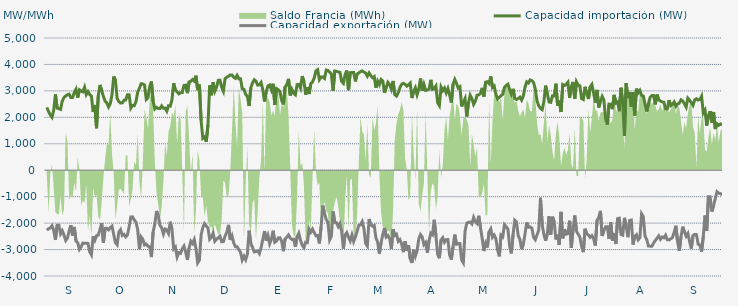
| Category | Capacidad importación (MW) | Capacidad exportación (MW) |
|---|---|---|
| 0 | 2375 | -2269.958 |
| 1900-01-01 | 2218.75 | -2210.458 |
| 1900-01-02 | 2093.75 | -2184.542 |
| 1900-01-03 | 2002.083 | -2097.042 |
| 1900-01-04 | 2264.583 | -2273.583 |
| 1900-01-05 | 2866.875 | -2637 |
| 1900-01-06 | 2346.958 | -2079.75 |
| 1900-01-07 | 2329.625 | -2082.083 |
| 1900-01-08 | 2302.458 | -2405.417 |
| 1900-01-09 | 2617.333 | -2289.667 |
| 1900-01-10 | 2750.042 | -2452.833 |
| 1900-01-11 | 2809.125 | -2657.958 |
| 1900-01-12 | 2857.375 | -2569.75 |
| 1900-01-13 | 2876.833 | -2291.708 |
| 1900-01-14 | 2750.708 | -2082.833 |
| 1900-01-15 | 2747.333 | -2466.667 |
| 1900-01-16 | 2937.458 | -2144.25 |
| 1900-01-17 | 3062.458 | -2672.417 |
| 1900-01-18 | 2740.417 | -2737.792 |
| 1900-01-19 | 3040.542 | -2994.125 |
| 1900-01-20 | 2995.708 | -2899.083 |
| 1900-01-21 | 2964.458 | -2754.583 |
| 1900-01-22 | 3138.792 | -2763.917 |
| 1900-01-23 | 2861.083 | -2758.667 |
| 1900-01-24 | 2973.75 | -2769.708 |
| 1900-01-25 | 2865 | -3086.792 |
| 1900-01-26 | 2805.417 | -3199.875 |
| 1900-01-27 | 2200 | -2500 |
| 1900-01-28 | 2468.25 | -2649 |
| 1900-01-29 | 1587.5 | -2475 |
| 1900-01-30 | 2818.542 | -2455.458 |
| 1900-01-31 | 3225.708 | -2239.583 |
| 1900-02-01 | 3000 | -2000 |
| 1900-02-02 | 2791.958 | -2738.25 |
| 1900-02-03 | 2607.167 | -2198.667 |
| 1900-02-04 | 2547.125 | -2197 |
| 1900-02-05 | 2393.292 | -2255.25 |
| 1900-02-06 | 2516 | -2169.167 |
| 1900-02-07 | 2853.667 | -2114.625 |
| 1900-02-08 | 3545.458 | -2428.042 |
| 1900-02-09 | 3402.833 | -2737.792 |
| 1900-02-10 | 2716.792 | -2816.833 |
| 1900-02-11 | 2599.417 | -2338.083 |
| 1900-02-12 | 2539.208 | -2246.333 |
| 1900-02-13 | 2547.375 | -2467.5 |
| 1900-02-14 | 2645.583 | -2424.333 |
| 1900-02-15 | 2654.167 | -2520.833 |
| 1900-02-16 | 2852.417 | -2448.375 |
| 1900-02-17 | 2850 | -2144.833 |
| 1900-02-18 | 2350 | -1768.75 |
| 1900-02-19 | 2450 | -1762.5 |
| 1900-02-20 | 2441.667 | -1881.25 |
| 1900-02-21 | 2597.917 | -1964.583 |
| 1900-02-22 | 2954.167 | -2250 |
| 1900-02-23 | 3102.32 | -2983.84 |
| 1900-02-24 | 3270.125 | -2524.167 |
| 1900-02-25 | 3263.958 | -2613.375 |
| 1900-02-26 | 3221.25 | -2826.5 |
| 1900-02-27 | 2678.333 | -2792.5 |
| 1900-02-28 | 2739.75 | -2875.042 |
| 1900-02-28 | 3161.75 | -2895.917 |
| 1900-03-01 | 3353.167 | -3283.208 |
| 1900-03-02 | 2604.75 | -2336.125 |
| 1900-03-03 | 2316.667 | -2037.25 |
| 1900-03-04 | 2377.083 | -1541.667 |
| 1900-03-05 | 2335.417 | -1708.333 |
| 1900-03-06 | 2333.083 | -2087.5 |
| 1900-03-07 | 2432.958 | -2175.833 |
| 1900-03-08 | 2341.417 | -2411.458 |
| 1900-03-09 | 2350 | -2224.167 |
| 1900-03-10 | 2233.333 | -2255.875 |
| 1900-03-11 | 2436.333 | -2388.333 |
| 1900-03-12 | 2422.917 | -1949.75 |
| 1900-03-13 | 2664.167 | -2243.25 |
| 1900-03-14 | 3289.125 | -2974.875 |
| 1900-03-15 | 3022.042 | -2905.375 |
| 1900-03-16 | 2967.917 | -3281.292 |
| 1900-03-17 | 2888.083 | -3117.75 |
| 1900-03-18 | 2932.458 | -3142.792 |
| 1900-03-19 | 2934.917 | -2973.208 |
| 1900-03-20 | 3202.583 | -2869.458 |
| 1900-03-21 | 3215.75 | -3094.417 |
| 1900-03-22 | 2915.5 | -3393.375 |
| 1900-03-23 | 3338.625 | -2938.583 |
| 1900-03-24 | 3362.542 | -2687.333 |
| 1900-03-25 | 3428.958 | -2770.5 |
| 1900-03-26 | 3372 | -2622.5 |
| 1900-03-27 | 3574.375 | -2972.542 |
| 1900-03-28 | 3028.917 | -3504.875 |
| 1900-03-29 | 3239.167 | -3400.917 |
| 1900-03-30 | 1878.75 | -2447.25 |
| 1900-03-31 | 1204.167 | -2164.583 |
| 1900-04-01 | 1258.333 | -2018.75 |
| 1900-04-02 | 1077.083 | -2108.333 |
| 1900-04-03 | 1711.917 | -2183.333 |
| 1900-04-04 | 3210.167 | -2609.5 |
| 1900-04-05 | 2835.417 | -2533.333 |
| 1900-04-06 | 3323.833 | -2378.417 |
| 1900-04-07 | 2986.708 | -2684.958 |
| 1900-04-08 | 3136.75 | -2609.25 |
| 1900-04-09 | 3398.958 | -2552.333 |
| 1900-04-10 | 3404.708 | -2496.458 |
| 1900-04-11 | 3136.792 | -2703.625 |
| 1900-04-12 | 2984.417 | -2700 |
| 1900-04-13 | 3466.5 | -2483.792 |
| 1900-04-14 | 3518.5 | -2345.833 |
| 1900-04-15 | 3555.167 | -2067 |
| 1900-04-16 | 3605.208 | -2635.583 |
| 1900-04-17 | 3603.083 | -2480.625 |
| 1900-04-18 | 3517.167 | -2743.458 |
| 1900-04-19 | 3473.958 | -2890.375 |
| 1900-04-20 | 3587.875 | -2893.625 |
| 1900-04-21 | 3454.583 | -3000.667 |
| 1900-04-22 | 3456.875 | -3104.042 |
| 1900-04-23 | 3080.708 | -3395.083 |
| 1900-04-24 | 3059.792 | -3254.417 |
| 1900-04-25 | 2872.417 | -3385.667 |
| 1900-04-26 | 2791.792 | -3162.083 |
| 1900-04-27 | 2427.708 | -2287.5 |
| 1900-04-28 | 3123.125 | -2773 |
| 1900-04-29 | 3298.917 | -2914.542 |
| 1900-04-30 | 3420.292 | -3090.167 |
| 1900-05-01 | 3370.083 | -3074.542 |
| 1900-05-02 | 3217.542 | -3055.958 |
| 1900-05-03 | 3229.292 | -3154.333 |
| 1900-05-04 | 3317 | -2928.75 |
| 1900-05-05 | 3040.5 | -2617.875 |
| 1900-05-06 | 2600 | -2300 |
| 1900-05-07 | 2973.125 | -2658.375 |
| 1900-05-08 | 3188.5 | -2468 |
| 1900-05-09 | 3225.417 | -2780.667 |
| 1900-05-10 | 3042.292 | -2615.25 |
| 1900-05-11 | 3269.292 | -2289.5 |
| 1900-05-12 | 2466.917 | -2722.042 |
| 1900-05-13 | 3087.042 | -2676.583 |
| 1900-05-14 | 3046.125 | -2559.917 |
| 1900-05-15 | 2981.833 | -2552.167 |
| 1900-05-16 | 2640.875 | -2681.583 |
| 1900-05-17 | 2488.417 | -3061.75 |
| 1900-05-18 | 3148 | -2596.625 |
| 1900-05-19 | 3235.333 | -2534.25 |
| 1900-05-20 | 3454.833 | -2446.292 |
| 1900-05-21 | 2826.208 | -2562.5 |
| 1900-05-22 | 3055.625 | -2616 |
| 1900-05-23 | 2910.667 | -2614.333 |
| 1900-05-24 | 2851.625 | -2898.833 |
| 1900-05-25 | 3236.792 | -2519.125 |
| 1900-05-26 | 3247.417 | -2381.958 |
| 1900-05-27 | 3102.208 | -2645.667 |
| 1900-05-28 | 3559.042 | -2840.083 |
| 1900-05-29 | 3354.708 | -2929.5 |
| 1900-05-30 | 2857.208 | -2721.292 |
| 1900-05-31 | 3142.708 | -2736.667 |
| 1900-06-01 | 2882.458 | -2227.083 |
| 1900-06-02 | 3271.833 | -2344.333 |
| 1900-06-03 | 3337.5 | -2224.542 |
| 1900-06-04 | 3489.625 | -2354.917 |
| 1900-06-05 | 3757.5 | -2480.083 |
| 1900-06-06 | 3803.5 | -2467.75 |
| 1900-06-07 | 3425.167 | -2769.083 |
| 1900-06-08 | 3524.417 | -2147.917 |
| 1900-06-09 | 3527.917 | -1337.5 |
| 1900-06-10 | 3470.417 | -1637.5 |
| 1900-06-11 | 3786.25 | -1866.667 |
| 1900-06-12 | 3770.917 | -1970.833 |
| 1900-06-13 | 3709.083 | -2634.458 |
| 1900-06-14 | 3643.708 | -2500.125 |
| 1900-06-15 | 3002.833 | -1558.333 |
| 1900-06-16 | 3753.5 | -1977.083 |
| 1900-06-17 | 3742 | -1987.792 |
| 1900-06-18 | 3717 | -2132.708 |
| 1900-06-19 | 3703.5 | -2019.625 |
| 1900-06-20 | 3356.5 | -2318.75 |
| 1900-06-21 | 3287.25 | -2961.542 |
| 1900-06-22 | 3613 | -2448.25 |
| 1900-06-23 | 3770.917 | -2358.208 |
| 1900-06-24 | 3026.833 | -2529 |
| 1900-06-25 | 3690.125 | -2672.167 |
| 1900-06-26 | 3691.917 | -2447.375 |
| 1900-06-27 | 3691.917 | -2696.25 |
| 1900-06-28 | 3359.625 | -2533.208 |
| 1900-06-29 | 3638.208 | -2312.042 |
| 1900-06-30 | 3676.542 | -2081.625 |
| 1900-07-01 | 3724.917 | -2066.75 |
| 1900-07-02 | 3757.5 | -1941.667 |
| 1900-07-03 | 3711.333 | -2204.125 |
| 1900-07-04 | 3675.458 | -2771.042 |
| 1900-07-05 | 3554.458 | -2867.542 |
| 1900-07-06 | 3680.333 | -1844.583 |
| 1900-07-07 | 3578.458 | -2062.333 |
| 1900-07-08 | 3498.667 | -2120.125 |
| 1900-07-09 | 3542.583 | -2088.25 |
| 1900-07-10 | 3116.583 | -2558.083 |
| 1900-07-11 | 3368.333 | -2721.125 |
| 1900-07-12 | 3235.167 | -3154.375 |
| 1900-07-13 | 3431.792 | -2737.167 |
| 1900-07-14 | 3373.458 | -2436.25 |
| 1900-07-15 | 2927.625 | -2181.583 |
| 1900-07-16 | 3136.625 | -2524.417 |
| 1900-07-17 | 3321.958 | -2467.708 |
| 1900-07-18 | 3237.167 | -2582.667 |
| 1900-07-19 | 3067.667 | -2979.292 |
| 1900-07-20 | 3375.875 | -2228.75 |
| 1900-07-21 | 2860.583 | -2468.833 |
| 1900-07-22 | 2803.375 | -2421.417 |
| 1900-07-23 | 2924.833 | -2685.667 |
| 1900-07-24 | 3128.125 | -2622.333 |
| 1900-07-25 | 3249.042 | -2786 |
| 1900-07-26 | 3285.957 | -3098.435 |
| 1900-07-27 | 3251.125 | -2683.875 |
| 1900-07-28 | 3179.958 | -3042.333 |
| 1900-07-29 | 3227.792 | -2833.458 |
| 1900-07-30 | 3292.833 | -3348.958 |
| 1900-07-31 | 2730.667 | -3504.917 |
| 1900-08-01 | 2985 | -3005.417 |
| 1900-08-02 | 3117.458 | -3250.417 |
| 1900-08-03 | 2855.083 | -3052.042 |
| 1900-08-04 | 3069.458 | -2602.292 |
| 1900-08-05 | 3466.417 | -2432.792 |
| 1900-08-06 | 3007.167 | -2522.875 |
| 1900-08-07 | 3244.375 | -2811.167 |
| 1900-08-08 | 3017.708 | -2737.208 |
| 1900-08-09 | 3032.833 | -3121.625 |
| 1900-08-10 | 3065.708 | -2665.083 |
| 1900-08-11 | 3418.292 | -2382.667 |
| 1900-08-12 | 3056.792 | -2438.792 |
| 1900-08-13 | 3079.167 | -1874.583 |
| 1900-08-14 | 3179.375 | -2471.917 |
| 1900-08-15 | 2552.25 | -3173.583 |
| 1900-08-16 | 2444.667 | -3327.792 |
| 1900-08-17 | 3144.958 | -2640.625 |
| 1900-08-18 | 3010.208 | -2550.208 |
| 1900-08-19 | 3107.125 | -2722.583 |
| 1900-08-20 | 2923.625 | -2627.417 |
| 1900-08-21 | 3090.583 | -2621.917 |
| 1900-08-22 | 2846.083 | -3210.25 |
| 1900-08-23 | 2560.75 | -3379.792 |
| 1900-08-24 | 3251.25 | -2896.042 |
| 1900-08-25 | 3432.333 | -2434.75 |
| 1900-08-26 | 3283.375 | -2799.542 |
| 1900-08-27 | 3108.792 | -2777.042 |
| 1900-08-28 | 3154.917 | -2772.25 |
| 1900-08-29 | 2413.25 | -3395.792 |
| 1900-08-30 | 2576 | -3503 |
| 1900-08-31 | 2711.917 | -2310.333 |
| 1900-09-01 | 2031.25 | -2002.083 |
| 1900-09-02 | 2544.667 | -1970.833 |
| 1900-09-03 | 2838.208 | -1962.5 |
| 1900-09-04 | 2706.708 | -2031.25 |
| 1900-09-05 | 2490.375 | -1785.417 |
| 1900-09-06 | 2612.792 | -1947.333 |
| 1900-09-07 | 2833 | -2014.333 |
| 1900-09-08 | 2851.583 | -1722.917 |
| 1900-09-09 | 2901.75 | -2171.25 |
| 1900-09-10 | 3113.667 | -2582.042 |
| 1900-09-11 | 2787.083 | -3055.958 |
| 1900-09-12 | 3331.625 | -2767.125 |
| 1900-09-13 | 3347 | -2920.625 |
| 1900-09-14 | 3277.833 | -2334.375 |
| 1900-09-15 | 3547.333 | -2216.875 |
| 1900-09-16 | 3127.583 | -2536.667 |
| 1900-09-17 | 3182.75 | -2450.958 |
| 1900-09-18 | 2868.792 | -2589.917 |
| 1900-09-19 | 2696.25 | -3016.542 |
| 1900-09-20 | 2758.458 | -3256.458 |
| 1900-09-21 | 2820.083 | -2452.083 |
| 1900-09-22 | 2874.792 | -2511.083 |
| 1900-09-23 | 3131.542 | -2059.125 |
| 1900-09-24 | 3205.375 | -2136.25 |
| 1900-09-25 | 3253.375 | -2224.125 |
| 1900-09-26 | 3057.042 | -2870.958 |
| 1900-09-27 | 2876.042 | -3146.333 |
| 1900-09-28 | 3076.708 | -2437.5 |
| 1900-09-29 | 2714.417 | -1890.667 |
| 1900-09-30 | 2675.25 | -1952.042 |
| 1900-10-01 | 2712.625 | -2473.333 |
| 1900-10-02 | 2762.542 | -2608.917 |
| 1900-10-03 | 2652 | -2984.583 |
| 1900-10-04 | 2806.792 | -2803.333 |
| 1900-10-05 | 3151.167 | -2401.458 |
| 1900-10-06 | 3341.792 | -1976.417 |
| 1900-10-07 | 3295.083 | -2154.25 |
| 1900-10-08 | 3415.542 | -2148.458 |
| 1900-10-09 | 3386.458 | -2191.625 |
| 1900-10-10 | 3315.833 | -2538.333 |
| 1900-10-11 | 3059.75 | -2627.417 |
| 1900-10-12 | 2619.042 | -2445.958 |
| 1900-10-13 | 2434.542 | -2258.708 |
| 1900-10-14 | 2336.958 | -1043.75 |
| 1900-10-15 | 2291.5 | -2066.667 |
| 1900-10-16 | 2591.375 | -2432.417 |
| 1900-10-17 | 3198.167 | -2666.208 |
| 1900-10-18 | 2894.833 | -2404.875 |
| 1900-10-19 | 2582.208 | -1743.542 |
| 1900-10-20 | 2566.333 | -2434.875 |
| 1900-10-21 | 2811.458 | -1757.708 |
| 1900-10-22 | 2808 | -1938.167 |
| 1900-10-23 | 3272.083 | -2618.542 |
| 1900-10-24 | 2447.208 | -2437.333 |
| 1900-10-25 | 2633.208 | -2826.667 |
| 1900-10-26 | 2202.083 | -1575 |
| 1900-10-27 | 3237.583 | -2574.625 |
| 1900-10-28 | 3201.042 | -2230.542 |
| 1900-10-29 | 3248.625 | -2416.417 |
| 1900-10-30 | 3327.583 | -2395.083 |
| 1900-10-31 | 2740.958 | -1910.417 |
| 1900-11-01 | 3160.083 | -2937.917 |
| 1900-11-02 | 3339 | -2237.833 |
| 1900-11-03 | 2697.208 | -1712.5 |
| 1900-11-04 | 3342.917 | -2305.083 |
| 1900-11-05 | 3218 | -2421.583 |
| 1900-11-06 | 3194.333 | -2530.333 |
| 1900-11-07 | 2706.458 | -2869.083 |
| 1900-11-08 | 2673 | -3096.5 |
| 1900-11-09 | 3156.5 | -2212.083 |
| 1900-11-10 | 2884.958 | -2401.708 |
| 1900-11-11 | 2692.292 | -2450.833 |
| 1900-11-12 | 3152.125 | -2539.5 |
| 1900-11-13 | 3244.042 | -2473.208 |
| 1900-11-14 | 2930.458 | -2581.292 |
| 1900-11-15 | 2559.833 | -2848.708 |
| 1900-11-16 | 3037.583 | -1901.417 |
| 1900-11-17 | 2375 | -1787.5 |
| 1900-11-18 | 2608.75 | -1537.5 |
| 1900-11-19 | 2790.667 | -2487.458 |
| 1900-11-20 | 2656.542 | -2277.167 |
| 1900-11-21 | 1950.833 | -2138.208 |
| 1900-11-22 | 1725 | -2133.333 |
| 1900-11-23 | 2500 | -2600 |
| 1900-11-24 | 2493.5 | -1964.583 |
| 1900-11-25 | 2311.125 | -2662.542 |
| 1900-11-26 | 2848.5 | -2386.333 |
| 1900-11-27 | 2541.5 | -2790.625 |
| 1900-11-28 | 2586.083 | -1829.542 |
| 1900-11-29 | 2229.167 | -1813.75 |
| 1900-11-30 | 3118.458 | -2430.875 |
| 1900-12-01 | 2560.5 | -2453.333 |
| 1900-12-02 | 1300 | -1800 |
| 1900-12-03 | 3293.208 | -2107.333 |
| 1900-12-04 | 2732.333 | -2531.667 |
| 1900-12-05 | 2958.208 | -1899.667 |
| 1900-12-06 | 2400 | -1885.417 |
| 1900-12-07 | 2949.792 | -2809.042 |
| 1900-12-08 | 2072.292 | -2500 |
| 1900-12-09 | 3083.958 | -2440.167 |
| 1900-12-10 | 2921.208 | -2632.667 |
| 1900-12-11 | 3017.667 | -2556.542 |
| 1900-12-12 | 2833.833 | -1646.083 |
| 1900-12-13 | 2807.833 | -1750 |
| 1900-12-14 | 2510.417 | -2496.792 |
| 1900-12-15 | 2220.833 | -2618.625 |
| 1900-12-16 | 2512.5 | -2867.042 |
| 1900-12-17 | 2756.375 | -2870.75 |
| 1900-12-18 | 2821.542 | -2876.667 |
| 1900-12-19 | 2821.833 | -2755.625 |
| 1900-12-20 | 2490.292 | -2656.833 |
| 1900-12-21 | 2862.667 | -2571.458 |
| 1900-12-22 | 2663.042 | -2482.25 |
| 1900-12-23 | 2613.625 | -2612.792 |
| 1900-12-24 | 2585.667 | -2523.458 |
| 1900-12-25 | 2571.292 | -2556.167 |
| 1900-12-26 | 2320.458 | -2456.542 |
| 1900-12-27 | 2316.542 | -2627.667 |
| 1900-12-28 | 2652.5 | -2635.708 |
| 1900-12-29 | 2442.625 | -2594.208 |
| 1900-12-30 | 2493.458 | -2546.125 |
| 1900-12-31 | 2582.917 | -2351.208 |
| 1901-01-01 | 2416.667 | -2100 |
| 1901-01-02 | 2504.5 | -2703.167 |
| 1901-01-03 | 2536.625 | -3052.25 |
| 1901-01-04 | 2662.208 | -2510.833 |
| 1901-01-05 | 2620.667 | -2134.75 |
| 1901-01-06 | 2511.833 | -2330.583 |
| 1901-01-07 | 2387.333 | -2494.25 |
| 1901-01-08 | 2724.583 | -2389 |
| 1901-01-09 | 2648.667 | -2691.542 |
| 1901-01-10 | 2557.292 | -2961.542 |
| 1901-01-11 | 2454.083 | -2472.25 |
| 1901-01-12 | 2661.417 | -2427.292 |
| 1901-01-13 | 2704.833 | -2434.167 |
| 1901-01-14 | 2653.75 | -2795.833 |
| 1901-01-15 | 2673.75 | -2822.875 |
| 1901-01-16 | 2800.917 | -3075.208 |
| 1901-01-17 | 2164.417 | -2510.625 |
| 1901-01-18 | 2270.833 | -1713.542 |
| 1901-01-19 | 1687.5 | -2291.667 |
| 1901-01-20 | 2066.667 | -1000 |
| 1901-01-21 | 2233.333 | -1000 |
| 1901-01-22 | 1804.167 | -1561.333 |
| 1901-01-23 | 2201.833 | -1341.667 |
| 1901-01-24 | 1556.25 | -1070.833 |
| 1901-01-25 | 1756.25 | -812.5 |
| 1901-01-26 | 1700 | -864.583 |
| 1901-01-27 | 1750 | -885.417 |
| 1901-01-28 | 1708.333 | -929.167 |